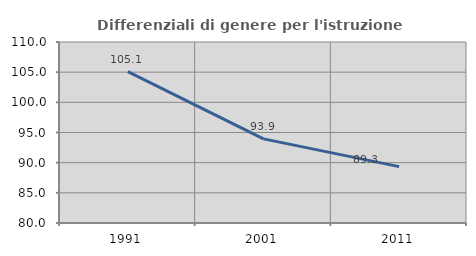
| Category | Differenziali di genere per l'istruzione superiore |
|---|---|
| 1991.0 | 105.101 |
| 2001.0 | 93.947 |
| 2011.0 | 89.345 |